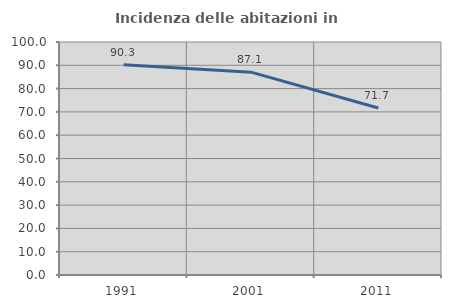
| Category | Incidenza delle abitazioni in proprietà  |
|---|---|
| 1991.0 | 90.265 |
| 2001.0 | 87.056 |
| 2011.0 | 71.663 |